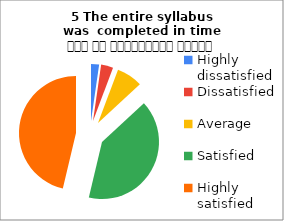
| Category | 5 The entire syllabus was  completed in time समय पर पाठ्यक्रम पूर्ण हुआ |
|---|---|
| Highly dissatisfied | 4 |
| Dissatisfied | 6 |
| Average | 13 |
| Satisfied | 71 |
| Highly satisfied | 81 |